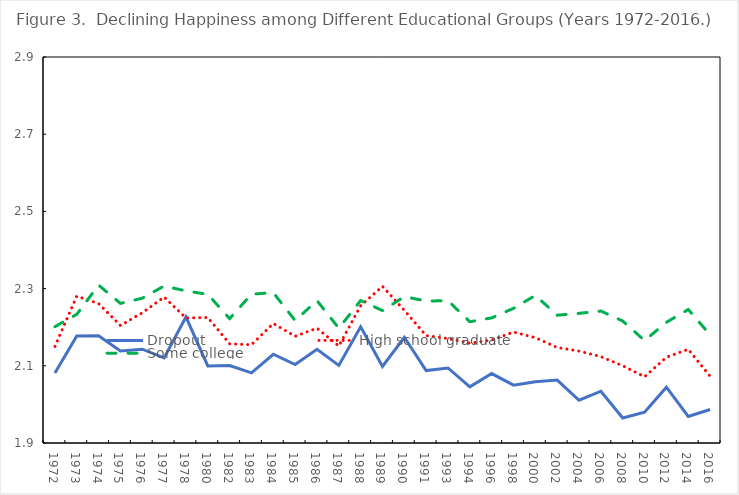
| Category | Dropout | High school graduate | Some college |
|---|---|---|---|
| 1972.0 | 2.082 | 2.15 | 2.201 |
| 1973.0 | 2.177 | 2.28 | 2.233 |
| 1974.0 | 2.178 | 2.261 | 2.309 |
| 1975.0 | 2.138 | 2.204 | 2.262 |
| 1976.0 | 2.143 | 2.237 | 2.275 |
| 1977.0 | 2.12 | 2.278 | 2.307 |
| 1978.0 | 2.227 | 2.224 | 2.294 |
| 1980.0 | 2.1 | 2.225 | 2.285 |
| 1982.0 | 2.1 | 2.157 | 2.222 |
| 1983.0 | 2.082 | 2.155 | 2.286 |
| 1984.0 | 2.13 | 2.21 | 2.289 |
| 1985.0 | 2.103 | 2.176 | 2.217 |
| 1986.0 | 2.143 | 2.198 | 2.269 |
| 1987.0 | 2.101 | 2.151 | 2.197 |
| 1988.0 | 2.201 | 2.256 | 2.269 |
| 1989.0 | 2.098 | 2.306 | 2.243 |
| 1990.0 | 2.174 | 2.244 | 2.279 |
| 1991.0 | 2.088 | 2.178 | 2.268 |
| 1993.0 | 2.094 | 2.171 | 2.269 |
| 1994.0 | 2.045 | 2.159 | 2.214 |
| 1996.0 | 2.08 | 2.167 | 2.224 |
| 1998.0 | 2.05 | 2.187 | 2.249 |
| 2000.0 | 2.059 | 2.173 | 2.282 |
| 2002.0 | 2.063 | 2.147 | 2.231 |
| 2004.0 | 2.011 | 2.138 | 2.236 |
| 2006.0 | 2.034 | 2.124 | 2.242 |
| 2008.0 | 1.965 | 2.1 | 2.216 |
| 2010.0 | 1.98 | 2.072 | 2.165 |
| 2012.0 | 2.045 | 2.122 | 2.213 |
| 2014.0 | 1.969 | 2.143 | 2.246 |
| 2016.0 | 1.987 | 2.073 | 2.18 |